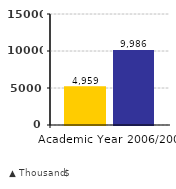
| Category | Tuition & Fees | Room & Board |
|---|---|---|
| 0 | 4959.428 | 9985.785 |